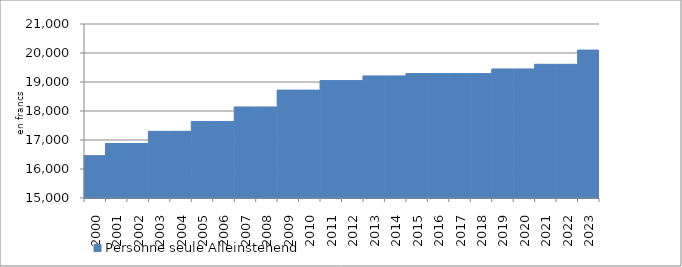
| Category | Personne seule |
|---|---|
| 2000.0 | 16460 |
| 2001.0 | 16880 |
| 2002.0 | 16880 |
| 2003.0 | 17300 |
| 2004.0 | 17300 |
| 2005.0 | 17640 |
| 2006.0 | 17640 |
| 2007.0 | 18140 |
| 2008.0 | 18140 |
| 2009.0 | 18720 |
| 2010.0 | 18720 |
| 2011.0 | 19050 |
| 2012.0 | 19050 |
| 2013.0 | 19210 |
| 2014.0 | 19210 |
| 2015.0 | 19290 |
| 2016.0 | 19290 |
| 2017.0 | 19290 |
| 2018.0 | 19290 |
| 2019.0 | 19450 |
| 2020.0 | 19450 |
| 2021.0 | 19610 |
| 2022.0 | 19610 |
| 2023.0 | 20100 |